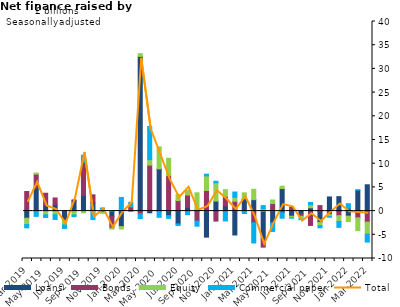
| Category | Loans | Bonds | Equity | Commercial paper |
|---|---|---|---|---|
| Mar-2019 | -1.502 | 4.131 | -1.348 | -0.683 |
| Apr-2019 | 4.878 | 2.92 | 0.227 | -1.109 |
| May-2019 | 1.148 | 2.622 | -0.792 | -0.561 |
| Jun-2019 | 1.336 | 1.437 | -0.771 | -1.001 |
| Jul-2019 | -1.705 | -0.281 | -0.927 | -0.742 |
| Aug-2019 | 2.189 | 0.174 | -0.815 | -0.357 |
| Sep-2019 | 3.267 | 6.981 | -0.37 | 1.548 |
| Oct-2019 | 1.784 | 1.651 | -0.377 | -1.416 |
| Nov-2019 | -0.02 | -0.195 | -0.259 | 0.654 |
| Dec-2019 | -1.168 | -2.415 | -0.207 | 0.031 |
| Jan-2020 | -3.262 | 0.155 | -0.507 | 2.731 |
| Feb-2020 | 0.152 | 0.764 | 0.107 | 0.826 |
| Mar-2020 | 32.643 | -0.54 | 0.567 | -1.041 |
| Apr-2020 | -0.359 | 9.698 | 1.146 | 7.014 |
| May-2020 | 8.794 | 0.131 | 4.629 | -1.303 |
| Jun-2020 | -0.963 | 7.494 | 3.656 | -0.564 |
| Jul-2020 | -2.711 | 2.212 | 1.244 | -0.34 |
| Aug-2020 | 0.789 | 2.614 | 0.958 | -0.762 |
| Sep-2020 | 0.212 | -2.122 | 3.646 | -1.058 |
| Oct-2020 | -5.492 | 4.349 | 3.08 | 0.366 |
| Nov-2020 | 2.111 | -2.106 | 3.855 | 0.327 |
| Dec-2020 | 1.116 | 2.015 | 1.384 | -2.076 |
| Jan-2021 | -5.037 | 2.081 | 0.835 | 1.11 |
| Feb-2021 | 2.461 | 0.193 | 1.202 | -0.517 |
| Mar-2021 | 2.419 | -2.452 | 2.187 | -4.272 |
| Apr-2021 | -5.848 | -1.754 | 0.506 | 0.65 |
| May-2021 | -2.471 | 1.596 | 0.754 | -1.817 |
| Jun-2021 | 4.752 | -0.338 | 0.503 | -1.166 |
| Jul-2021 | -1.079 | 0.867 | -0.337 | -0.072 |
| Aug-2021 | -0.597 | -0.499 | -0.567 | -0.136 |
| Sep-2021 | 0.7 | -3.026 | 0.646 | 0.481 |
| Oct-2021 | -2.39 | 1.158 | -0.687 | -0.446 |
| Nov-2021 | 2.987 | -0.729 | -0.439 | -0.107 |
| Dec-2021 | 3.045 | -0.957 | -1.224 | -1.25 |
| Jan-2022 | -1.069 | 0.598 | -1.13 | 0.961 |
| Feb-2022 | 4.424 | -1.431 | -2.695 | 0.058 |
| Mar-2022 | 5.555 | -2.323 | -2.55 | -1.663 |